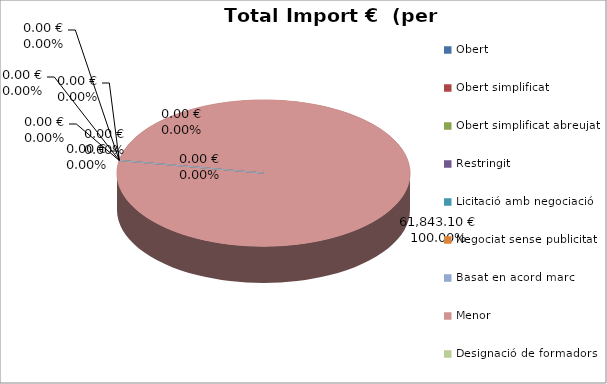
| Category | Total preu              (amb iva) |
|---|---|
| Obert | 0 |
| Obert simplificat | 0 |
| Obert simplificat abreujat | 0 |
| Restringit | 0 |
| Licitació amb negociació | 0 |
| Negociat sense publicitat | 0 |
| Basat en acord marc | 0 |
| Menor | 61843.1 |
| Designació de formadors | 0 |